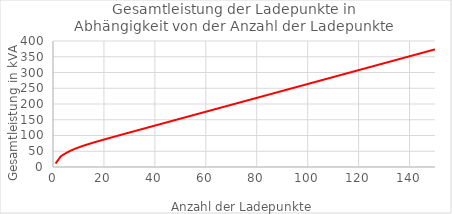
| Category | Series 0 |
|---|---|
| 1.0 | 11 |
| 2.0 | 22 |
| 3.0 | 33 |
| 4.0 | 38.707 |
| 5.0 | 43.694 |
| 6.0 | 48.108 |
| 7.0 | 52.068 |
| 8.0 | 55.665 |
| 9.0 | 58.976 |
| 10.0 | 62.059 |
| 11.0 | 64.96 |
| 12.0 | 67.717 |
| 13.0 | 70.36 |
| 14.0 | 72.911 |
| 15.0 | 75.391 |
| 16.0 | 77.813 |
| 17.0 | 80.189 |
| 18.0 | 82.529 |
| 19.0 | 84.841 |
| 20.0 | 87.129 |
| 21.0 | 89.4 |
| 22.0 | 91.655 |
| 23.0 | 93.9 |
| 24.0 | 96.135 |
| 25.0 | 98.363 |
| 26.0 | 100.585 |
| 27.0 | 102.803 |
| 28.0 | 105.017 |
| 29.0 | 107.228 |
| 30.0 | 109.437 |
| 31.0 | 111.644 |
| 32.0 | 113.85 |
| 33.0 | 116.054 |
| 34.0 | 118.258 |
| 35.0 | 120.461 |
| 36.0 | 122.663 |
| 37.0 | 124.865 |
| 38.0 | 127.066 |
| 39.0 | 129.267 |
| 40.0 | 131.468 |
| 41.0 | 133.669 |
| 42.0 | 135.869 |
| 43.0 | 138.07 |
| 44.0 | 140.27 |
| 45.0 | 142.47 |
| 46.0 | 144.671 |
| 47.0 | 146.871 |
| 48.0 | 149.071 |
| 49.0 | 151.271 |
| 50.0 | 153.471 |
| 51.0 | 155.671 |
| 52.0 | 157.871 |
| 53.0 | 160.071 |
| 54.0 | 162.271 |
| 55.0 | 164.471 |
| 56.0 | 166.671 |
| 57.0 | 168.871 |
| 58.0 | 171.071 |
| 59.0 | 173.271 |
| 60.0 | 175.471 |
| 61.0 | 177.672 |
| 62.0 | 179.872 |
| 63.0 | 182.072 |
| 64.0 | 184.272 |
| 65.0 | 186.472 |
| 66.0 | 188.672 |
| 67.0 | 190.872 |
| 68.0 | 193.072 |
| 69.0 | 195.272 |
| 70.0 | 197.472 |
| 71.0 | 199.672 |
| 72.0 | 201.872 |
| 73.0 | 204.072 |
| 74.0 | 206.272 |
| 75.0 | 208.472 |
| 76.0 | 210.672 |
| 77.0 | 212.872 |
| 78.0 | 215.072 |
| 79.0 | 217.272 |
| 80.0 | 219.472 |
| 81.0 | 221.672 |
| 82.0 | 223.872 |
| 83.0 | 226.072 |
| 84.0 | 228.272 |
| 85.0 | 230.472 |
| 86.0 | 232.672 |
| 87.0 | 234.872 |
| 88.0 | 237.072 |
| 89.0 | 239.272 |
| 90.0 | 241.472 |
| 91.0 | 243.672 |
| 92.0 | 245.872 |
| 93.0 | 248.072 |
| 94.0 | 250.272 |
| 95.0 | 252.472 |
| 96.0 | 254.672 |
| 97.0 | 256.872 |
| 98.0 | 259.072 |
| 99.0 | 261.272 |
| 100.0 | 263.472 |
| 101.0 | 265.672 |
| 102.0 | 267.872 |
| 103.0 | 270.072 |
| 104.0 | 272.272 |
| 105.0 | 274.472 |
| 106.0 | 276.672 |
| 107.0 | 278.872 |
| 108.0 | 281.072 |
| 109.0 | 283.272 |
| 110.0 | 285.472 |
| 111.0 | 287.672 |
| 112.0 | 289.872 |
| 113.0 | 292.072 |
| 114.0 | 294.272 |
| 115.0 | 296.472 |
| 116.0 | 298.672 |
| 117.0 | 300.872 |
| 118.0 | 303.072 |
| 119.0 | 305.272 |
| 120.0 | 307.472 |
| 121.0 | 309.672 |
| 122.0 | 311.872 |
| 123.0 | 314.072 |
| 124.0 | 316.272 |
| 125.0 | 318.472 |
| 126.0 | 320.672 |
| 127.0 | 322.872 |
| 128.0 | 325.072 |
| 129.0 | 327.272 |
| 130.0 | 329.472 |
| 131.0 | 331.672 |
| 132.0 | 333.872 |
| 133.0 | 336.072 |
| 134.0 | 338.272 |
| 135.0 | 340.472 |
| 136.0 | 342.672 |
| 137.0 | 344.872 |
| 138.0 | 347.072 |
| 139.0 | 349.272 |
| 140.0 | 351.472 |
| 141.0 | 353.672 |
| 142.0 | 355.872 |
| 143.0 | 358.072 |
| 144.0 | 360.272 |
| 145.0 | 362.472 |
| 146.0 | 364.672 |
| 147.0 | 366.872 |
| 148.0 | 369.072 |
| 149.0 | 371.272 |
| 150.0 | 373.472 |